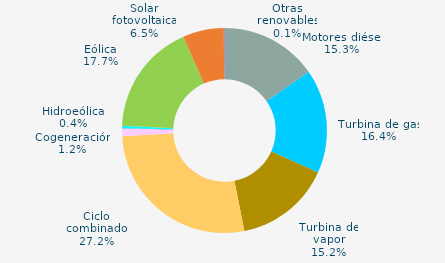
| Category | Series 0 |
|---|---|
| Motores diésel | 15.338 |
| Turbina de gas | 16.38 |
| Turbina de vapor | 15.181 |
| Ciclo combinado | 27.22 |
| Cogeneración | 1.202 |
| Hidráulica | 0.048 |
| Hidroeólica | 0.356 |
| Eólica | 17.693 |
| Solar fotovoltaica | 6.467 |
| Otras renovables | 0.116 |